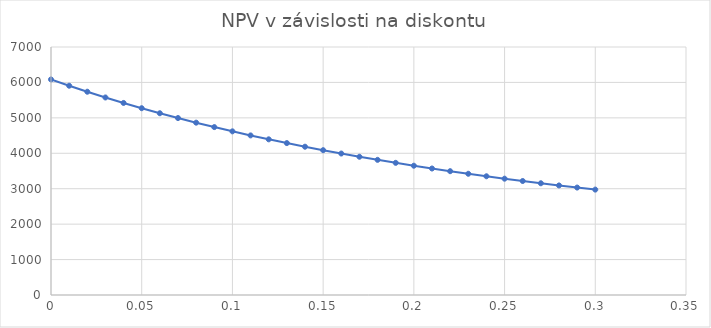
| Category | Series 0 |
|---|---|
| 0.0 | 6084.459 |
| 0.01 | 5906.968 |
| 0.02 | 5737.447 |
| 0.03 | 5575.44 |
| 0.04 | 5420.523 |
| 0.05 | 5272.299 |
| 0.06 | 5130.399 |
| 0.07 | 4994.478 |
| 0.08 | 4864.212 |
| 0.09 | 4739.299 |
| 0.1 | 4619.457 |
| 0.11 | 4504.421 |
| 0.12 | 4393.941 |
| 0.13 | 4287.786 |
| 0.14 | 4185.736 |
| 0.15 | 4087.586 |
| 0.16 | 3993.142 |
| 0.17 | 3902.223 |
| 0.18 | 3814.657 |
| 0.19 | 3730.285 |
| 0.2 | 3648.954 |
| 0.21 | 3570.52 |
| 0.22 | 3494.85 |
| 0.23 | 3421.816 |
| 0.24 | 3351.296 |
| 0.25 | 3283.179 |
| 0.26 | 3217.356 |
| 0.27 | 3153.725 |
| 0.28 | 3092.191 |
| 0.29 | 3032.662 |
| 0.3 | 2975.052 |